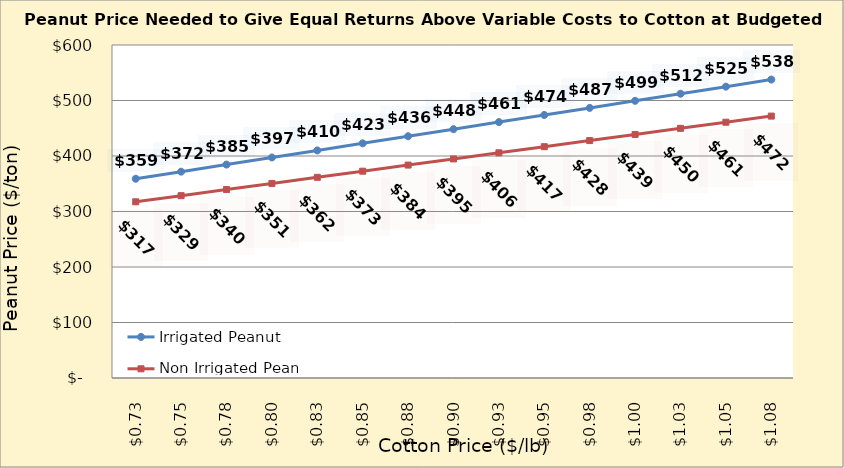
| Category | Irrigated Peanut | Non Irrigated Peanut |
|---|---|---|
| 0.7249999999999999 | 359.004 | 317.489 |
| 0.7499999999999999 | 371.77 | 328.518 |
| 0.7749999999999999 | 384.536 | 339.547 |
| 0.7999999999999999 | 397.302 | 350.577 |
| 0.825 | 410.068 | 361.606 |
| 0.85 | 422.834 | 372.636 |
| 0.875 | 435.6 | 383.665 |
| 0.9 | 448.366 | 394.694 |
| 0.925 | 461.132 | 405.724 |
| 0.9500000000000001 | 473.898 | 416.753 |
| 0.9750000000000001 | 486.664 | 427.783 |
| 1.0 | 499.43 | 438.812 |
| 1.025 | 512.196 | 449.842 |
| 1.0499999999999998 | 524.961 | 460.871 |
| 1.0749999999999997 | 537.727 | 471.9 |